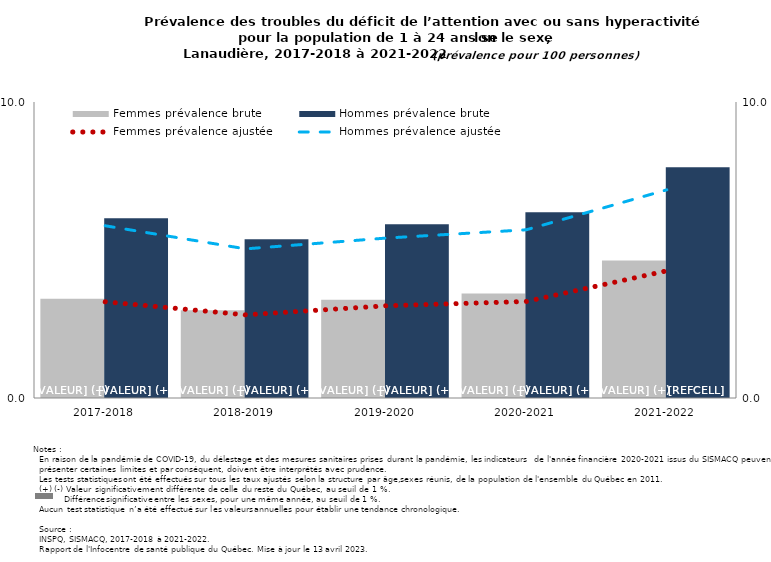
| Category | Femmes prévalence brute | Hommes prévalence brute |
|---|---|---|
| 2017-2018 | 3.355 | 6.073 |
| 2018-2019 | 2.965 | 5.359 |
| 2019-2020 | 3.316 | 5.869 |
| 2020-2021 | 3.534 | 6.276 |
| 2021-2022 | 4.642 | 7.798 |